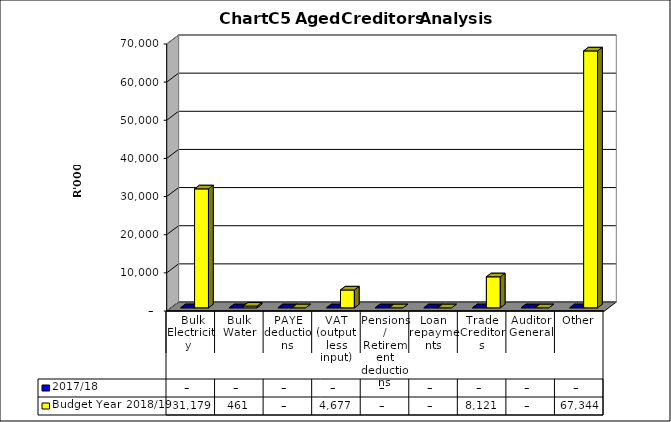
| Category | 2017/18 | Budget Year 2018/19 |
|---|---|---|
|  Bulk Electricity  | 0 | 31179404.56 |
| Bulk Water | 0 | 461077.64 |
| PAYE deductions | 0 | 0 |
| VAT (output less input) | 0 | 4676910.69 |
| Pensions / Retirement deductions | 0 | 0 |
| Loan repayments | 0 | 0 |
| Trade Creditors | 0 | 8121133.73 |
| Auditor General | 0 | 0 |
| Other | 0 | 67343556.39 |